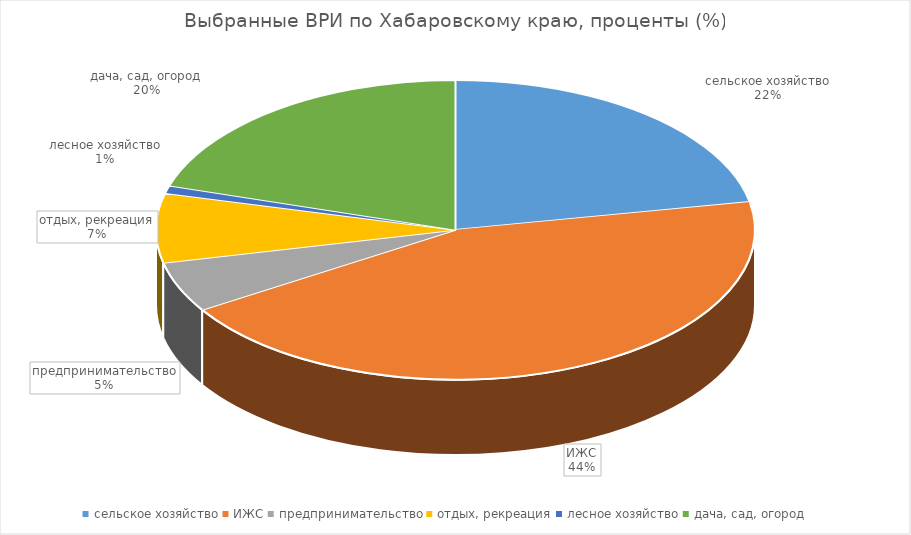
| Category | Хабаровский край |
|---|---|
| сельское хозяйство | 22.029 |
| ИЖС | 44.014 |
| предпринимательство | 5.442 |
| отдых, рекреация | 7.466 |
| лесное хозяйство | 0.827 |
| дача, сад, огород | 20.222 |